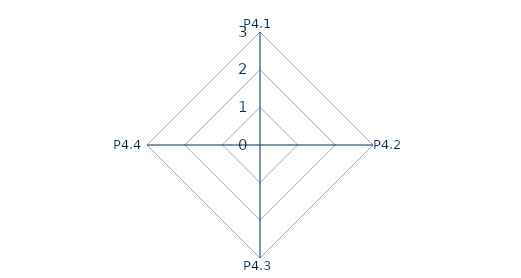
| Category | Series 0 |
|---|---|
| P4.1 | 0 |
| P4.2 | 0 |
| P4.3 | 0 |
| P4.4 | 0 |